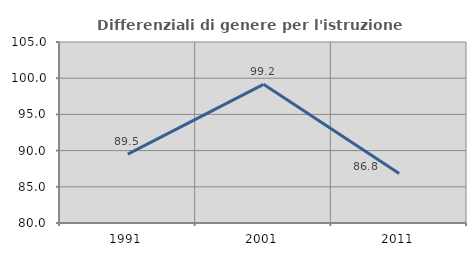
| Category | Differenziali di genere per l'istruzione superiore |
|---|---|
| 1991.0 | 89.523 |
| 2001.0 | 99.153 |
| 2011.0 | 86.846 |